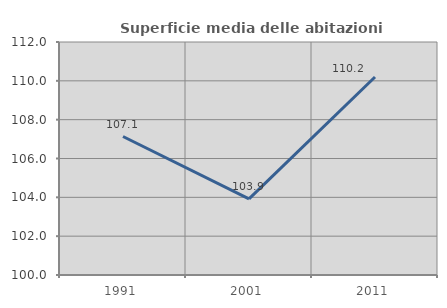
| Category | Superficie media delle abitazioni occupate |
|---|---|
| 1991.0 | 107.132 |
| 2001.0 | 103.923 |
| 2011.0 | 110.198 |